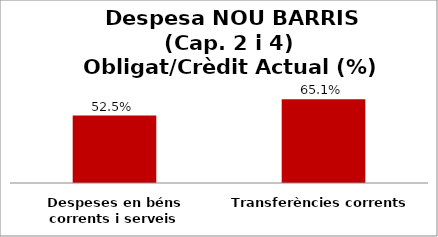
| Category | Series 0 |
|---|---|
| Despeses en béns corrents i serveis | 0.525 |
| Transferències corrents | 0.651 |